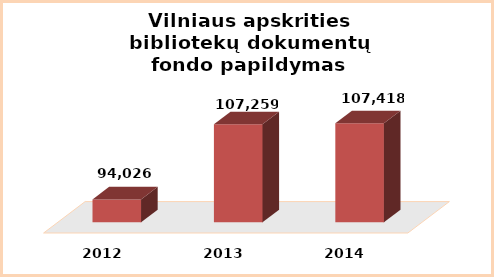
| Category | Series 0 |
|---|---|
| 2012.0 | 94026 |
| 2013.0 | 107259 |
| 2014.0 | 107418 |